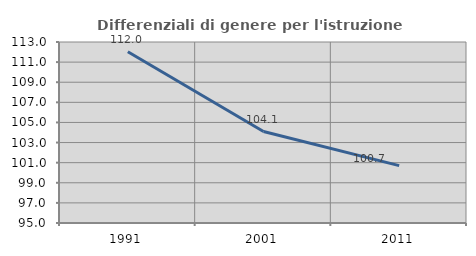
| Category | Differenziali di genere per l'istruzione superiore |
|---|---|
| 1991.0 | 112.032 |
| 2001.0 | 104.092 |
| 2011.0 | 100.706 |